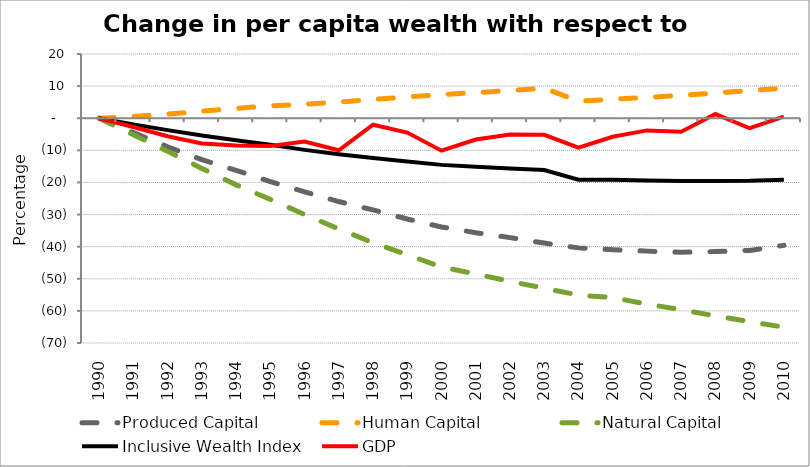
| Category | Produced Capital  | Human Capital | Natural Capital | Inclusive Wealth Index | GDP |
|---|---|---|---|---|---|
| 1990.0 | 0 | 0 | 0 | 0 | 0 |
| 1991.0 | -4.463 | 0.548 | -5.179 | -1.924 | -2.736 |
| 1992.0 | -8.878 | 1.308 | -10.288 | -3.705 | -5.629 |
| 1993.0 | -12.898 | 2.179 | -15.625 | -5.393 | -7.845 |
| 1994.0 | -16.249 | 3.06 | -20.754 | -6.877 | -8.507 |
| 1995.0 | -19.728 | 3.849 | -25.259 | -8.291 | -8.662 |
| 1996.0 | -22.952 | 4.347 | -29.975 | -9.856 | -7.26 |
| 1997.0 | -25.95 | 5.043 | -34.48 | -11.214 | -9.984 |
| 1998.0 | -28.556 | 5.845 | -38.77 | -12.376 | -2.026 |
| 1999.0 | -31.392 | 6.654 | -42.488 | -13.45 | -4.452 |
| 2000.0 | -33.858 | 7.37 | -46.36 | -14.528 | -10.11 |
| 2001.0 | -35.661 | 7.956 | -48.471 | -15.113 | -6.648 |
| 2002.0 | -37.182 | 8.623 | -50.815 | -15.646 | -5.064 |
| 2003.0 | -38.884 | 9.338 | -52.933 | -16.14 | -5.175 |
| 2004.0 | -40.379 | 5.294 | -55.079 | -19.166 | -9.167 |
| 2005.0 | -40.971 | 5.895 | -55.859 | -19.158 | -5.782 |
| 2006.0 | -41.388 | 6.466 | -57.9 | -19.425 | -3.792 |
| 2007.0 | -41.764 | 7.135 | -59.652 | -19.561 | -4.22 |
| 2008.0 | -41.503 | 7.869 | -61.543 | -19.554 | 1.3 |
| 2009.0 | -41.188 | 8.635 | -63.351 | -19.497 | -3.119 |
| 2010.0 | -39.603 | 9.396 | -65.077 | -19.14 | 0.493 |